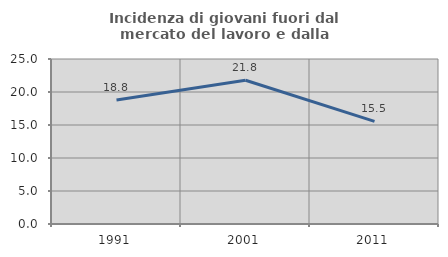
| Category | Incidenza di giovani fuori dal mercato del lavoro e dalla formazione  |
|---|---|
| 1991.0 | 18.797 |
| 2001.0 | 21.78 |
| 2011.0 | 15.544 |